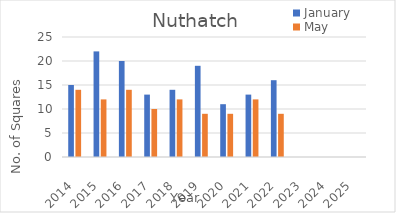
| Category | January | May |
|---|---|---|
| 2014.0 | 15 | 14 |
| 2015.0 | 22 | 12 |
| 2016.0 | 20 | 14 |
| 2017.0 | 13 | 10 |
| 2018.0 | 14 | 12 |
| 2019.0 | 19 | 9 |
| 2020.0 | 11 | 9 |
| 2021.0 | 13 | 12 |
| 2022.0 | 16 | 9 |
| 2023.0 | 0 | 0 |
| 2024.0 | 0 | 0 |
| 2025.0 | 0 | 0 |